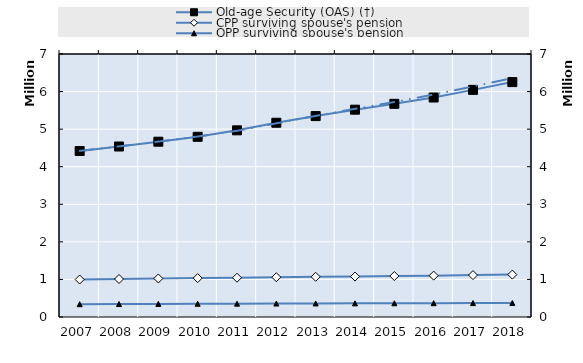
| Category | Old-age Security (OAS) (†) | CPP surviving spouse's pension | Survivors' pension from occupational accident insurance | 0 | Series 14 | Series 15 | Series 16 | Series 17 | Series 18 | Series 19 |
|---|---|---|---|---|---|---|---|---|---|---|
| 2007.0 | 4418151 | 997763 |  |  |  |  |  |  |  |  |
| 2008.0 | 4537772 | 1011375 |  |  |  |  |  |  |  |  |
| 2009.0 | 4665856 | 1025507 |  |  |  |  |  |  |  |  |
| 2010.0 | 4795668 | 1034977 |  |  |  |  |  |  |  |  |
| 2011.0 | 4968281 | 1045438 |  |  |  |  |  |  |  |  |
| 2012.0 | 5169972 | 1058629 |  |  |  |  |  |  |  |  |
| 2013.0 | 5347606 | 1070438 |  |  |  |  |  |  |  |  |
| 2014.0 | 5517973 | 1076175 |  |  |  |  |  |  |  |  |
| 2015.0 | 5673651 | 1089715 |  |  |  |  |  |  |  |  |
| 2016.0 | 5841722 | 1101213 |  |  |  |  |  |  |  |  |
| 2017.0 | 6044812 | 1115779 |  |  |  |  |  |  |  |  |
| 2018.0 | 6252274 | 1129004 |  |  |  |  |  |  |  |  |